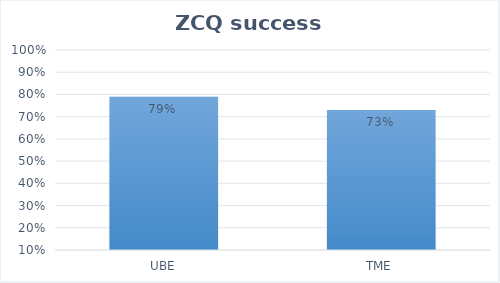
| Category | Series 0 |
|---|---|
| UBE | 0.79 |
| TME | 0.73 |